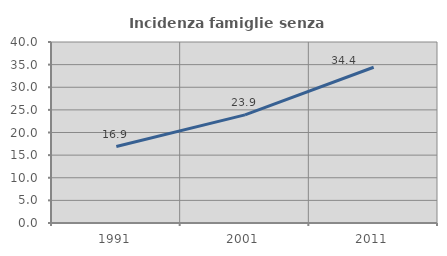
| Category | Incidenza famiglie senza nuclei |
|---|---|
| 1991.0 | 16.89 |
| 2001.0 | 23.888 |
| 2011.0 | 34.414 |